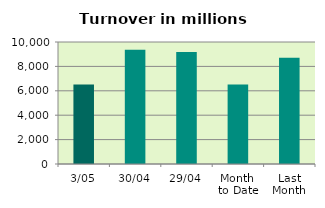
| Category | Series 0 |
|---|---|
| 3/05 | 6509.626 |
| 30/04 | 9369.834 |
| 29/04 | 9174.684 |
| Month 
to Date | 6509.626 |
| Last
Month | 8713.977 |